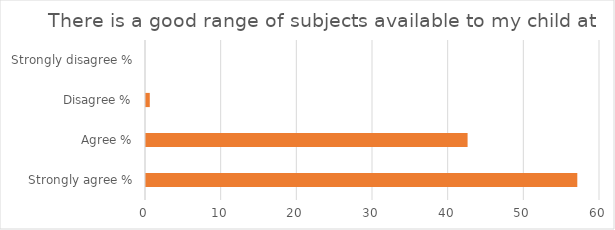
| Category | Series 1 |
|---|---|
| Strongly agree % | 57 |
| Agree % | 42.5 |
| Disagree % | 0.5 |
| Strongly disagree % | 0 |